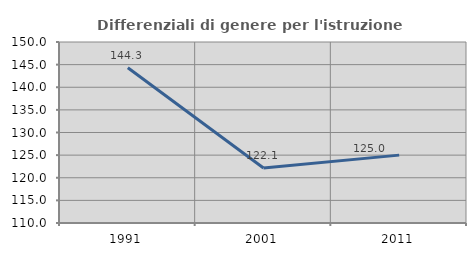
| Category | Differenziali di genere per l'istruzione superiore |
|---|---|
| 1991.0 | 144.298 |
| 2001.0 | 122.14 |
| 2011.0 | 125 |